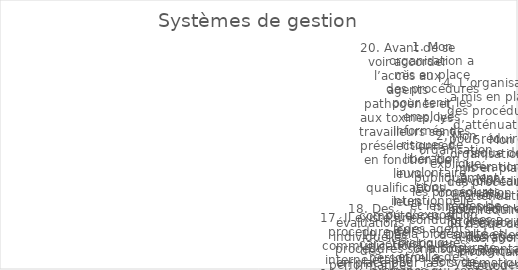
| Category | Series 0 |
|---|---|
| 1. Mon organisation a mis en place des procédures pour tenir les employés informés des risques de libération involontaire et/ou intentionnelle ou d’exposition à des agents biologiques et/ou à des toxines qui sont stockés ou manipulés dans nos installation | 1 |
| 2. Mon organisation explique publiquement les procédures et les règles de conduite liées à la biosécurité et à la biosûreté lors de l’orientation des nouveaux employés. | 1 |
| 3. Mon organisation a mis en place un processus d’analyse des risques-avantages systématique pour la recherche à double usage. | 2 |
| 4. L’organisation a mis en place des procédures d’atténuation pour réduire le risque de libération involontaire et/ou intentionnelle ou d’exposition à des agents biologiques et/ou des toxines stockés ou manipulés dans mon installation. | 0 |
| 5. Mon organisation a mis en place des procédures d’atténuation pour réduire le risque de libération involontaire et/ou intentionnelle ou d’exposition à des agents biologiques et/ou à des toxines stockés ou manipulés dans nos installations. | 0 |
| 6. Mon organisation a mis en place des procédures qui détaillent les actions requises lors d’un incident. | 5 |
| 7. Les leçons tirées des exercices d’urgence ont amélioré les performances organisationnelles. | 3 |
| 8. Mon organisation organise régulièrement des exercices d’intervention d’urgence. | 3 |
| 9. Il existe une liste à jour du personnel ayant un accès autorisé aux agents biologiques. | 1 |
| 10. L’utilisation des enseignements tirés des exercices d’urgence a amélioré les performances organisationnelles. | 3 |
| 11. Il existe une procédure permettant aux employés de signaler un comportement inhabituel à l’égard d’un collègue. | 0 |
| 12. L’utilisation des enseignements tirés des violations de la biosécurité/biosûreté ou des quasi-accidents a amélioré les performances organisationnelles. | 4 |
| 13. Il existe une liste disponible et à jour du personnel autorisé à accéder aux agents biologiques. | 2 |
| 14.  L’organisation a une formation continue en matière de biosécurité et de biosûreté et une formation axée sur les compétences pour les employés. | 4 |
| 15. Les informations concernant les mesures, procédures et politiques de biosécurité et de biosûreté sont facilement accessibles aux employés. | 2 |
| 16. Il existe une procédure permettant aux employés de signaler le comportement inhabituel d’un collègue. | 1 |
| 17. Il existe une procédure de communication interne établie pour informer les employés des incidents de biosécurité et de biosûreté et des quasi-accidents. | 3 |
| 18. Des évaluations individuelles des performances en matière de biosécurité/biosûreté ont lieu régulièrement. | 0 |
| 19. Des procédures sont en place pour la décontamination et la gestion des déchets. | 3 |
| 20. Avant de se voir accorder l’accès aux agents pathogènes et aux toxines, les travailleurs sont présélectionnés en fonction de leurs qualifications, leurs compétences et leurs caractéristiques personnelles appropriées pour le poste, et ainsi ils sont dé | 2 |